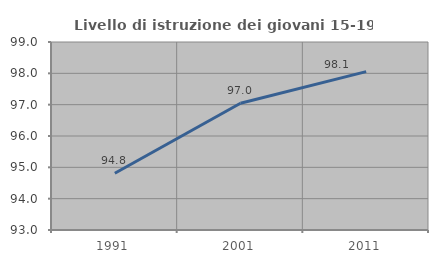
| Category | Livello di istruzione dei giovani 15-19 anni |
|---|---|
| 1991.0 | 94.81 |
| 2001.0 | 97.046 |
| 2011.0 | 98.054 |